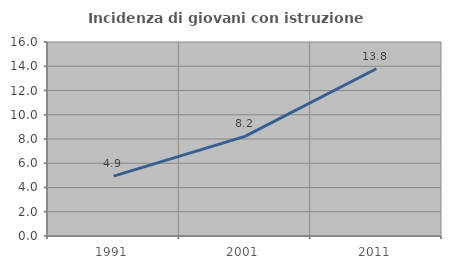
| Category | Incidenza di giovani con istruzione universitaria |
|---|---|
| 1991.0 | 4.938 |
| 2001.0 | 8.219 |
| 2011.0 | 13.793 |